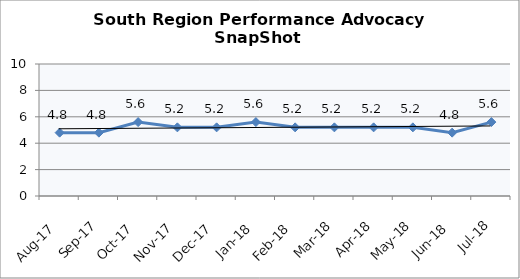
| Category | South Region |
|---|---|
| Aug-17 | 4.8 |
| Sep-17 | 4.8 |
| Oct-17 | 5.6 |
| Nov-17 | 5.2 |
| Dec-17 | 5.2 |
| Jan-18 | 5.6 |
| Feb-18 | 5.2 |
| Mar-18 | 5.2 |
| Apr-18 | 5.2 |
| May-18 | 5.2 |
| Jun-18 | 4.8 |
| Jul-18 | 5.6 |